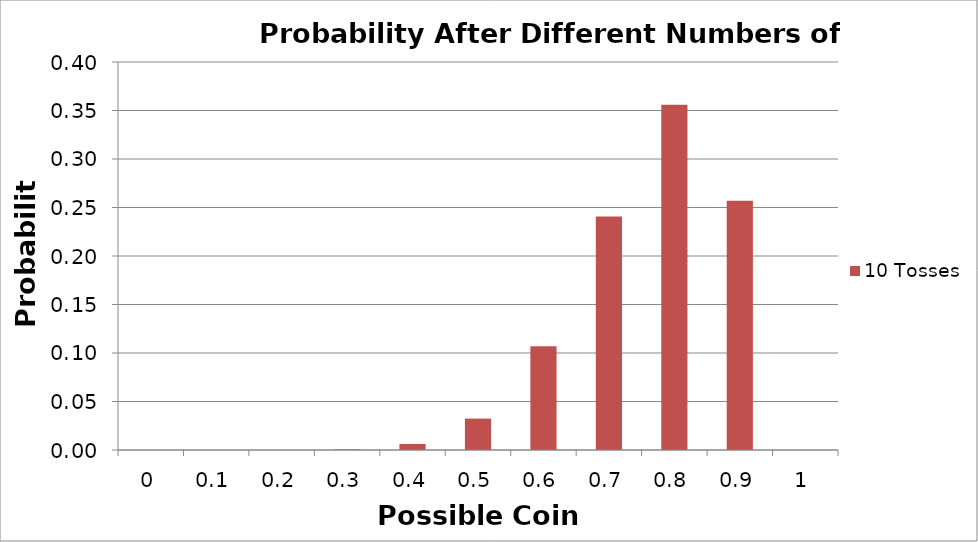
| Category | 10 Tosses |
|---|---|
| 0.0 | 0 |
| 0.1 | 0 |
| 0.2 | 0 |
| 0.3 | 0.001 |
| 0.4 | 0.006 |
| 0.5 | 0.032 |
| 0.6 | 0.107 |
| 0.7 | 0.241 |
| 0.8 | 0.356 |
| 0.9 | 0.257 |
| 1.0 | 0 |